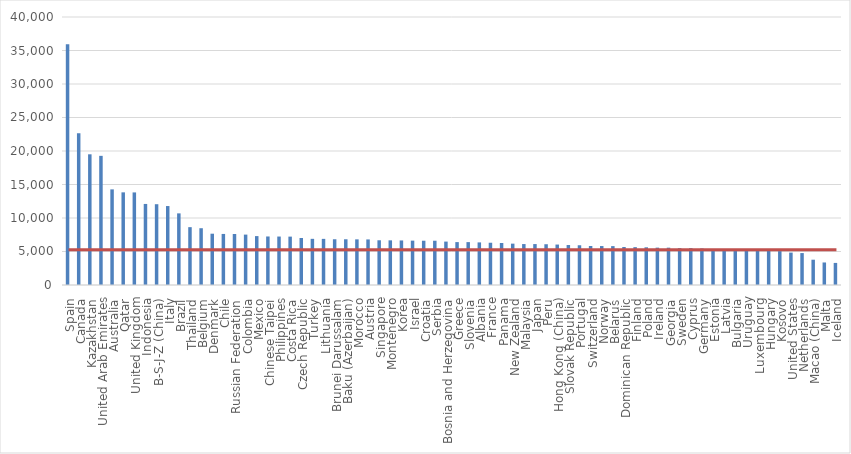
| Category | Series 0 |
|---|---|
| Spain | 35943 |
| Canada | 22653 |
| Kazakhstan | 19507 |
| United Arab Emirates | 19277 |
| Australia | 14273 |
| Qatar | 13828 |
| United Kingdom | 13818 |
| Indonesia | 12098 |
| B-S-J-Z (China) | 12058 |
| Italy | 11785 |
| Brazil | 10691 |
| Thailand | 8633 |
| Belgium | 8475 |
| Denmark | 7657 |
| Chile | 7621 |
| Russian Federation | 7608 |
| Colombia | 7522 |
| Mexico | 7299 |
| Chinese Taipei | 7243 |
| Philippines | 7233 |
| Costa Rica | 7221 |
| Czech Republic | 7019 |
| Turkey | 6890 |
| Lithuania | 6885 |
| Brunei Darussalam | 6828 |
| Baku (Azerbaijan) | 6827 |
| Morocco | 6814 |
| Austria | 6802 |
| Singapore | 6676 |
| Montenegro | 6666 |
| Korea | 6650 |
| Israel | 6623 |
| Croatia | 6609 |
| Serbia | 6609 |
| Bosnia and Herzegovina | 6480 |
| Greece | 6403 |
| Slovenia | 6401 |
| Albania | 6359 |
| France | 6308 |
| Panama | 6270 |
| New Zealand | 6173 |
| Malaysia | 6111 |
| Japan | 6109 |
| Peru | 6086 |
| Hong Kong (China) | 6037 |
| Slovak Republic | 5965 |
| Portugal | 5932 |
| Switzerland | 5822 |
| Norway | 5813 |
| Belarus | 5803 |
| Dominican Republic | 5674 |
| Finland | 5649 |
| Poland | 5625 |
| Ireland | 5577 |
| Georgia | 5572 |
| Sweden | 5504 |
| Cyprus | 5503 |
| Germany | 5451 |
| Estonia | 5316 |
| Latvia | 5303 |
| Bulgaria | 5294 |
| Uruguay | 5263 |
| Luxembourg | 5230 |
| Hungary | 5132 |
| Kosovo | 5058 |
| United States | 4838 |
| Netherlands | 4765 |
| Macao (China) | 3775 |
| Malta | 3363 |
| Iceland | 3296 |